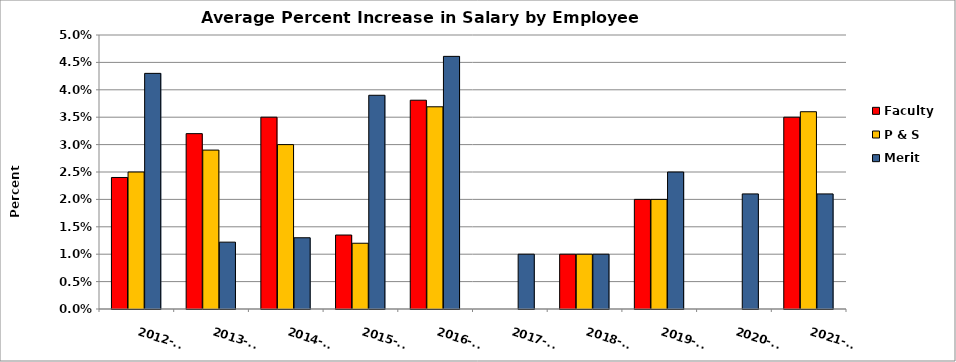
| Category | Faculty | P & S | Merit |
|---|---|---|---|
| 2012-13 | 0.024 | 0.025 | 0.043 |
| 2013-14 | 0.032 | 0.029 | 0.012 |
| 2014-15 | 0.035 | 0.03 | 0.013 |
| 2015-16 | 0.014 | 0.012 | 0.039 |
| 2016-17 | 0.038 | 0.037 | 0.046 |
| 2017-18 | 0 | 0 | 0.01 |
| 2018-19 | 0.01 | 0.01 | 0.01 |
| 2019-20 | 0.02 | 0.02 | 0.025 |
| 2020-21 | 0 | 0 | 0.021 |
| 2021-22 | 0.035 | 0.036 | 0.021 |